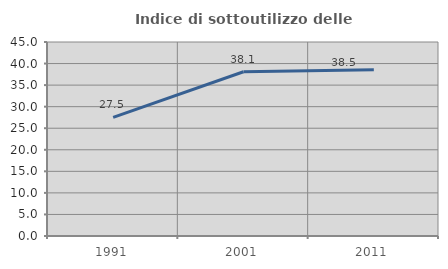
| Category | Indice di sottoutilizzo delle abitazioni  |
|---|---|
| 1991.0 | 27.514 |
| 2001.0 | 38.091 |
| 2011.0 | 38.549 |